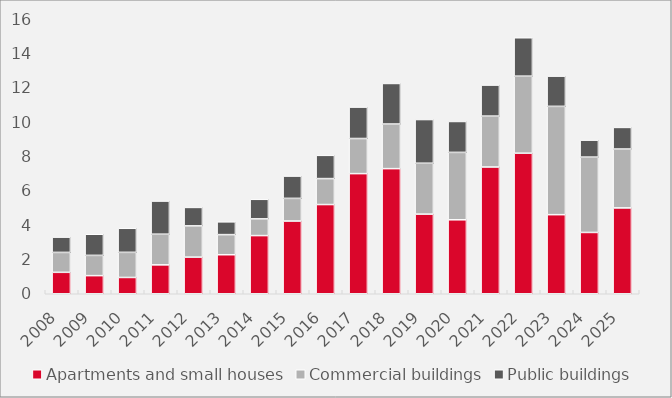
| Category | Apartments and small houses | Commercial buildings | Public buildings |
|---|---|---|---|
| 2008.0 | 1.247 | 1.16 | 0.889 |
| 2009.0 | 1.054 | 1.179 | 1.228 |
| 2010.0 | 0.948 | 1.461 | 1.399 |
| 2011.0 | 1.681 | 1.785 | 1.927 |
| 2012.0 | 2.13 | 1.82 | 1.073 |
| 2013.0 | 2.27 | 1.17 | 0.744 |
| 2014.0 | 3.384 | 0.972 | 1.138 |
| 2015.0 | 4.231 | 1.319 | 1.298 |
| 2016.0 | 5.191 | 1.51 | 1.353 |
| 2017.0 | 6.989 | 2.043 | 1.828 |
| 2018.0 | 7.279 | 2.595 | 2.36 |
| 2019.0 | 4.633 | 2.961 | 2.542 |
| 2020.0 | 4.304 | 3.921 | 1.799 |
| 2021.0 | 7.375 | 2.961 | 1.805 |
| 2022.0 | 8.177 | 4.483 | 2.236 |
| 2023.0 | 4.602 | 6.301 | 1.76 |
| 2024.0 | 3.567 | 4.384 | 0.988 |
| 2025.0 | 4.995 | 3.426 | 1.257 |